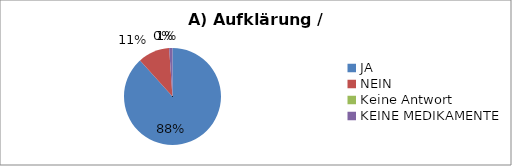
| Category | Series 0 |
|---|---|
| JA | 159 |
| NEIN | 19 |
| Keine Antwort | 0 |
| KEINE MEDIKAMENTE | 2 |